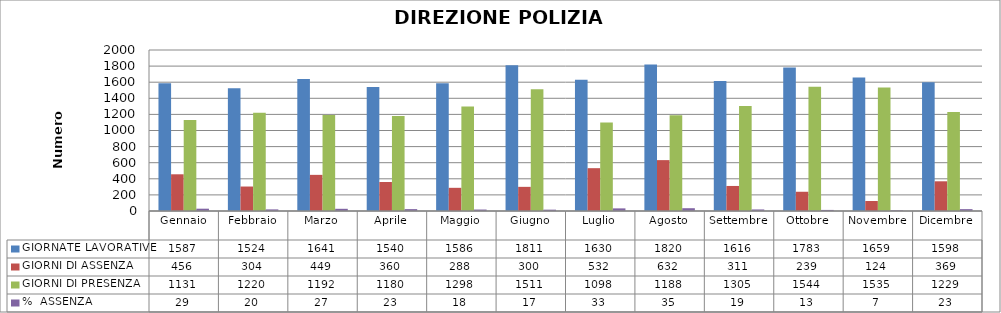
| Category | GIORNATE LAVORATIVE | GIORNI DI ASSENZA | GIORNI DI PRESENZA | %  ASSENZA |
|---|---|---|---|---|
| Gennaio | 1587 | 456 | 1131 | 28.733 |
| Febbraio | 1524 | 304 | 1220 | 19.948 |
| Marzo | 1641 | 449 | 1192 | 27.361 |
| Aprile | 1540 | 360 | 1180 | 23.377 |
| Maggio | 1586 | 288 | 1298 | 18.159 |
| Giugno | 1811 | 300 | 1511 | 16.565 |
| Luglio | 1630 | 532 | 1098 | 32.638 |
| Agosto | 1820 | 632 | 1188 | 34.725 |
| Settembre | 1616 | 311 | 1305 | 19.245 |
| Ottobre | 1783 | 239 | 1544 | 13.404 |
| Novembre | 1659 | 124 | 1535 | 7.474 |
| Dicembre | 1598 | 369 | 1229 | 23.091 |